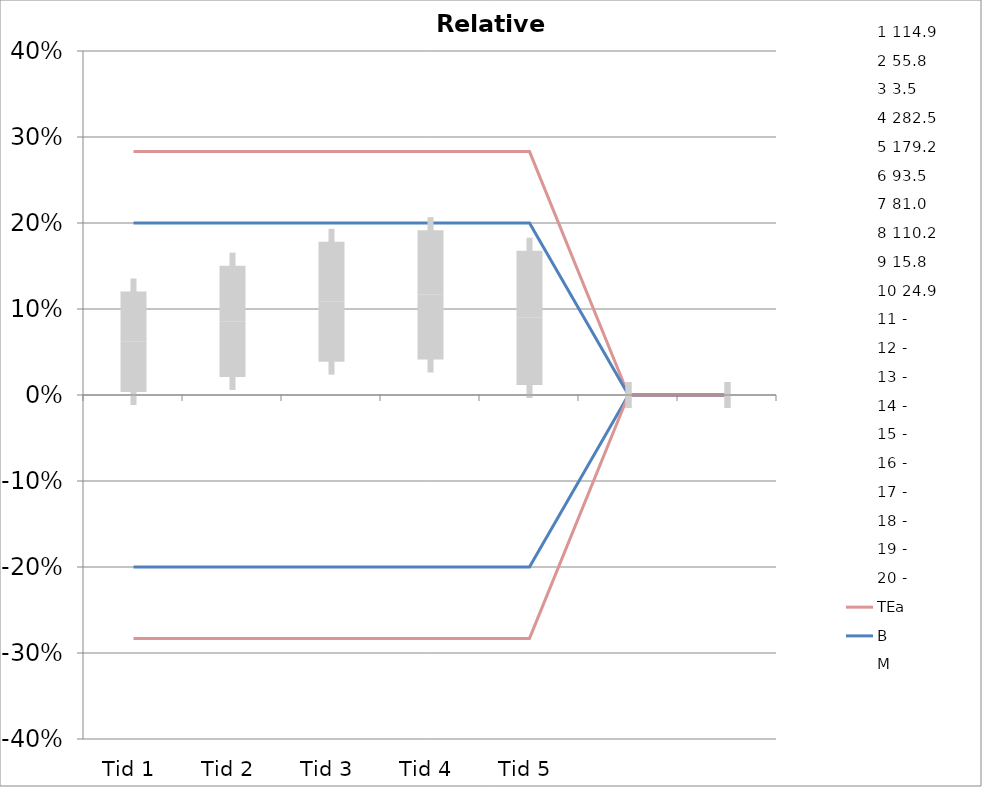
| Category | 1 | 2 | 3 | 4 | 5 | 6 | 7 | 8 | 9 | 10 | 11 | 12 | 13 | 14 | 15 | 16 | 17 | 18 | 19 | 20 | TEa | B | -B | -TEa | M |
|---|---|---|---|---|---|---|---|---|---|---|---|---|---|---|---|---|---|---|---|---|---|---|---|---|---|
| Tid 1 | 0.168 | 0.129 | 0.168 | 0.064 | -0.056 | -0.044 | 0.044 | -0.005 | 0.111 | 0.039 | 0 | 0 | 0 | 0 | 0 | 0 | 0 | 0 | 0 | 0 | 0.283 | 0.2 | -0.2 | -0.283 | 0.062 |
| Tid 2 | 0.182 | 0.104 | 0.197 | 0.083 | -0.031 | 0.021 | 0.06 | 0.019 | 0.228 | -0.007 | 0 | 0 | 0 | 0 | 0 | 0 | 0 | 0 | 0 | 0 | 0.283 | 0.2 | -0.2 | -0.283 | 0.086 |
| Tid 3 | 0.201 | 0.141 | 0.254 | 0 | -0.029 | 0.076 | 0.128 | -0.009 | 0.126 | 0.087 | 0 | 0 | 0 | 0 | 0 | 0 | 0 | 0 | 0 | 0 | 0.283 | 0.2 | -0.2 | -0.283 | 0.108 |
| Tid 4 | 0.207 | 0.132 | 0.311 | 0 | 0.008 | 0.041 | 0.077 | 0.037 | 0.169 | 0.067 | 0 | 0 | 0 | 0 | 0 | 0 | 0 | 0 | 0 | 0 | 0.283 | 0.2 | -0.2 | -0.283 | 0.116 |
| Tid 5 | 0.134 | 0.126 | 0.254 | 0 | -0.03 | -0.045 | 0.172 | 0.027 | 0.154 | 0.017 | 0 | 0 | 0 | 0 | 0 | 0 | 0 | 0 | 0 | 0 | 0.283 | 0.2 | -0.2 | -0.283 | 0.09 |